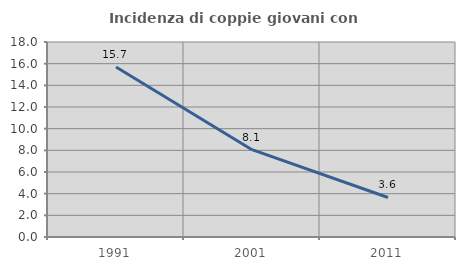
| Category | Incidenza di coppie giovani con figli |
|---|---|
| 1991.0 | 15.686 |
| 2001.0 | 8.06 |
| 2011.0 | 3.65 |